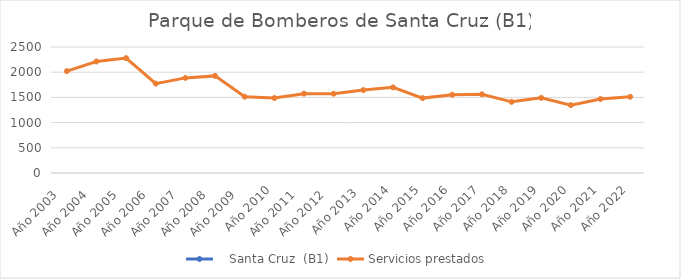
| Category |    Santa Cruz  (B1) | Servicios prestados  |
|---|---|---|
| Año 2003   |  | 2021 |
| Año 2004   |  | 2212 |
| Año 2005   |  | 2280 |
| Año 2006   |  | 1773 |
| Año 2007   |  | 1887 |
| Año 2008   |  | 1927 |
| Año 2009   |  | 1514 |
| Año 2010 |  | 1487 |
| Año 2011   |  | 1574 |
| Año 2012   |  | 1574 |
| Año 2013  |  | 1645 |
| Año 2014 |  | 1699 |
| Año 2015 |  | 1486 |
| Año 2016 |  | 1553 |
| Año 2017 |  | 1561 |
| Año 2018 |  | 1412 |
| Año 2019 |  | 1491 |
| Año 2020 |  | 1347 |
| Año 2021 |  | 1469 |
| Año 2022 |  | 1512 |